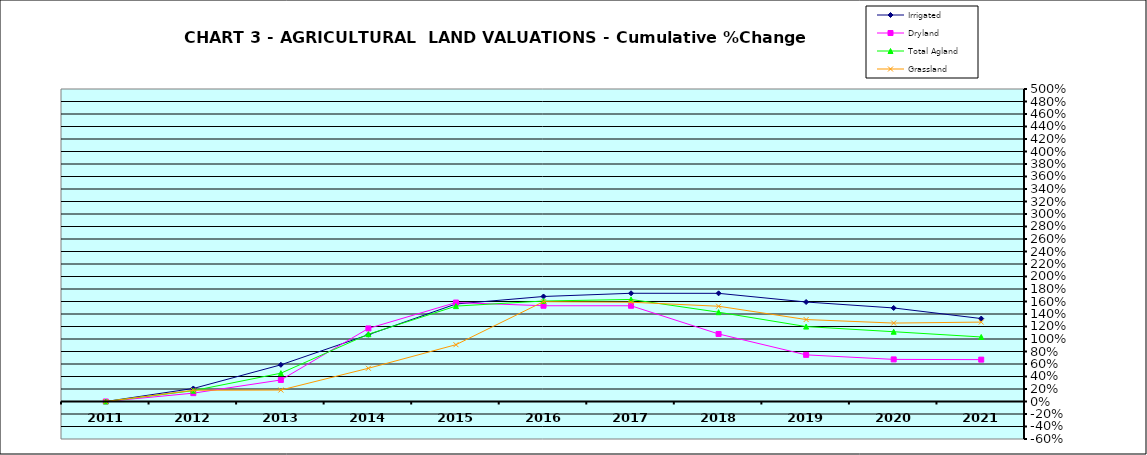
| Category | Irrigated | Dryland | Total Agland | Grassland |
|---|---|---|---|---|
| 2011.0 | 0 | 0 | 0 | 0 |
| 2012.0 | 0.208 | 0.134 | 0.173 | 0.18 |
| 2013.0 | 0.587 | 0.344 | 0.453 | 0.183 |
| 2014.0 | 1.069 | 1.169 | 1.077 | 0.532 |
| 2015.0 | 1.56 | 1.583 | 1.526 | 0.909 |
| 2016.0 | 1.68 | 1.532 | 1.608 | 1.597 |
| 2017.0 | 1.732 | 1.532 | 1.633 | 1.589 |
| 2018.0 | 1.731 | 1.081 | 1.429 | 1.524 |
| 2019.0 | 1.592 | 0.746 | 1.199 | 1.311 |
| 2020.0 | 1.497 | 0.674 | 1.116 | 1.255 |
| 2021.0 | 1.327 | 0.67 | 1.032 | 1.27 |